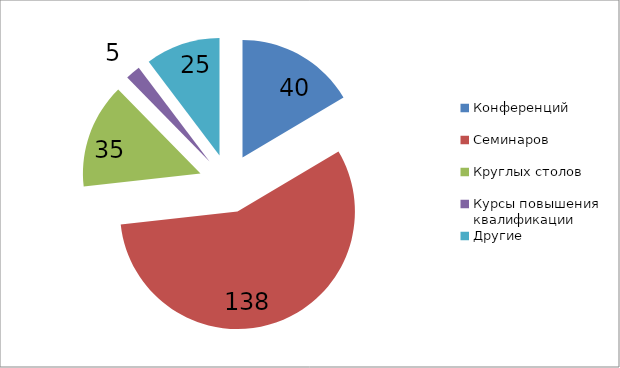
| Category | Series 0 |
|---|---|
| Конференций  | 40 |
| Семинаров | 138 |
| Круглых столов  | 35 |
| Курсы повышения квалификации  | 5 |
| Другие | 25 |